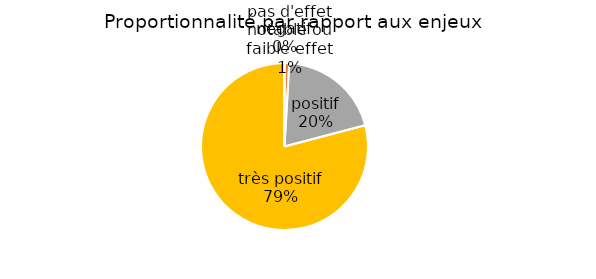
| Category | Series 0 |
|---|---|
| négatif | 0 |
| pas d'effet notable ou faible effet | 0.009 |
| positif | 0.2 |
| très positif | 0.791 |